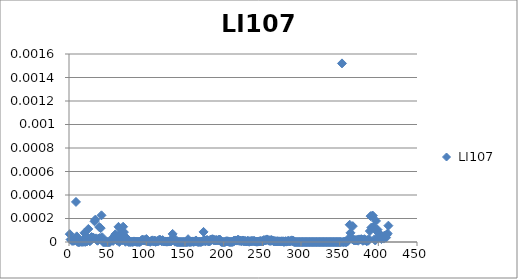
| Category |  LI107  |
|---|---|
| 0 | 0 |
| 1 | 0 |
| 2 | 0 |
| 3 | 0 |
| 4 | 0 |
| 5 | 0 |
| 6 | 0 |
| 7 | 0 |
| 8 | 0 |
| 9 | 0 |
| 10 | 0 |
| 11 | 0 |
| 12 | 0 |
| 13 | 0 |
| 14 | 0 |
| 15 | 0 |
| 16 | 0 |
| 17 | 0 |
| 18 | 0 |
| 19 | 0 |
| 20 | 0 |
| 21 | 0 |
| 22 | 0 |
| 23 | 0 |
| 24 | 0 |
| 25 | 0 |
| 26 | 0 |
| 27 | 0 |
| 28 | 0 |
| 29 | 0 |
| 30 | 0 |
| 31 | 0 |
| 32 | 0 |
| 33 | 0 |
| 34 | 0 |
| 35 | 0 |
| 36 | 0 |
| 37 | 0 |
| 38 | 0 |
| 39 | 0 |
| 40 | 0 |
| 41 | 0 |
| 42 | 0 |
| 43 | 0 |
| 44 | 0 |
| 45 | 0 |
| 46 | 0 |
| 47 | 0 |
| 48 | 0 |
| 49 | 0 |
| 50 | 0 |
| 51 | 0 |
| 52 | 0 |
| 53 | 0 |
| 54 | 0 |
| 55 | 0 |
| 56 | 0 |
| 57 | 0 |
| 58 | 0 |
| 59 | 0 |
| 60 | 0 |
| 61 | 0 |
| 62 | 0 |
| 63 | 0 |
| 64 | 0 |
| 65 | 0 |
| 66 | 0 |
| 67 | 0 |
| 68 | 0 |
| 69 | 0 |
| 70 | 0 |
| 71 | 0 |
| 72 | 0 |
| 73 | 0 |
| 74 | 0 |
| 75 | 0 |
| 76 | 0 |
| 77 | 0 |
| 78 | 0 |
| 79 | 0 |
| 80 | 0 |
| 81 | 0 |
| 82 | 0 |
| 83 | 0 |
| 84 | 0 |
| 85 | 0 |
| 86 | 0 |
| 87 | 0 |
| 88 | 0 |
| 89 | 0 |
| 90 | 0 |
| 91 | 0 |
| 92 | 0 |
| 93 | 0 |
| 94 | 0 |
| 95 | 0 |
| 96 | 0 |
| 97 | 0 |
| 98 | 0 |
| 99 | 0 |
| 100 | 0 |
| 101 | 0 |
| 102 | 0 |
| 103 | 0 |
| 104 | 0 |
| 105 | 0 |
| 106 | 0 |
| 107 | 0 |
| 108 | 0 |
| 109 | 0 |
| 110 | 0 |
| 111 | 0 |
| 112 | 0 |
| 113 | 0 |
| 114 | 0 |
| 115 | 0 |
| 116 | 0 |
| 117 | 0 |
| 118 | 0 |
| 119 | 0 |
| 120 | 0 |
| 121 | 0 |
| 122 | 0 |
| 123 | 0 |
| 124 | 0 |
| 125 | 0 |
| 126 | 0 |
| 127 | 0 |
| 128 | 0 |
| 129 | 0 |
| 130 | 0 |
| 131 | 0 |
| 132 | 0 |
| 133 | 0 |
| 134 | 0 |
| 135 | 0 |
| 136 | 0 |
| 137 | 0 |
| 138 | 0 |
| 139 | 0 |
| 140 | 0 |
| 141 | 0 |
| 142 | 0 |
| 143 | 0 |
| 144 | 0 |
| 145 | 0 |
| 146 | 0 |
| 147 | 0 |
| 148 | 0 |
| 149 | 0 |
| 150 | 0 |
| 151 | 0 |
| 152 | 0 |
| 153 | 0 |
| 154 | 0 |
| 155 | 0 |
| 156 | 0 |
| 157 | 0 |
| 158 | 0 |
| 159 | 0 |
| 160 | 0 |
| 161 | 0 |
| 162 | 0 |
| 163 | 0 |
| 164 | 0 |
| 165 | 0 |
| 166 | 0 |
| 167 | 0 |
| 168 | 0 |
| 169 | 0 |
| 170 | 0 |
| 171 | 0 |
| 172 | 0 |
| 173 | 0 |
| 174 | 0 |
| 175 | 0 |
| 176 | 0 |
| 177 | 0 |
| 178 | 0 |
| 179 | 0 |
| 180 | 0 |
| 181 | 0 |
| 182 | 0 |
| 183 | 0 |
| 184 | 0 |
| 185 | 0 |
| 186 | 0 |
| 187 | 0 |
| 188 | 0 |
| 189 | 0 |
| 190 | 0 |
| 191 | 0 |
| 192 | 0 |
| 193 | 0 |
| 194 | 0 |
| 195 | 0 |
| 196 | 0 |
| 197 | 0 |
| 198 | 0 |
| 199 | 0 |
| 200 | 0 |
| 201 | 0 |
| 202 | 0 |
| 203 | 0 |
| 204 | 0 |
| 205 | 0 |
| 206 | 0 |
| 207 | 0 |
| 208 | 0 |
| 209 | 0 |
| 210 | 0 |
| 211 | 0 |
| 212 | 0 |
| 213 | 0 |
| 214 | 0 |
| 215 | 0 |
| 216 | 0 |
| 217 | 0 |
| 218 | 0 |
| 219 | 0 |
| 220 | 0 |
| 221 | 0 |
| 222 | 0 |
| 223 | 0 |
| 224 | 0 |
| 225 | 0 |
| 226 | 0 |
| 227 | 0 |
| 228 | 0 |
| 229 | 0 |
| 230 | 0 |
| 231 | 0 |
| 232 | 0 |
| 233 | 0 |
| 234 | 0 |
| 235 | 0 |
| 236 | 0 |
| 237 | 0 |
| 238 | 0 |
| 239 | 0 |
| 240 | 0 |
| 241 | 0 |
| 242 | 0 |
| 243 | 0 |
| 244 | 0 |
| 245 | 0 |
| 246 | 0 |
| 247 | 0 |
| 248 | 0 |
| 249 | 0 |
| 250 | 0 |
| 251 | 0 |
| 252 | 0 |
| 253 | 0 |
| 254 | 0 |
| 255 | 0 |
| 256 | 0 |
| 257 | 0 |
| 258 | 0 |
| 259 | 0 |
| 260 | 0 |
| 261 | 0 |
| 262 | 0 |
| 263 | 0 |
| 264 | 0 |
| 265 | 0 |
| 266 | 0 |
| 267 | 0 |
| 268 | 0 |
| 269 | 0 |
| 270 | 0 |
| 271 | 0 |
| 272 | 0 |
| 273 | 0 |
| 274 | 0 |
| 275 | 0 |
| 276 | 0 |
| 277 | 0 |
| 278 | 0 |
| 279 | 0 |
| 280 | 0 |
| 281 | 0 |
| 282 | 0 |
| 283 | 0 |
| 284 | 0 |
| 285 | 0 |
| 286 | 0 |
| 287 | 0 |
| 288 | 0 |
| 289 | 0 |
| 290 | 0 |
| 291 | 0 |
| 292 | 0 |
| 293 | 0 |
| 294 | 0 |
| 295 | 0 |
| 296 | 0 |
| 297 | 0 |
| 298 | 0 |
| 299 | 0 |
| 300 | 0 |
| 301 | 0 |
| 302 | 0 |
| 303 | 0 |
| 304 | 0 |
| 305 | 0 |
| 306 | 0 |
| 307 | 0 |
| 308 | 0 |
| 309 | 0 |
| 310 | 0 |
| 311 | 0 |
| 312 | 0 |
| 313 | 0 |
| 314 | 0 |
| 315 | 0 |
| 316 | 0 |
| 317 | 0 |
| 318 | 0 |
| 319 | 0 |
| 320 | 0 |
| 321 | 0 |
| 322 | 0 |
| 323 | 0 |
| 324 | 0 |
| 325 | 0 |
| 326 | 0 |
| 327 | 0 |
| 328 | 0 |
| 329 | 0 |
| 330 | 0 |
| 331 | 0 |
| 332 | 0 |
| 333 | 0 |
| 334 | 0 |
| 335 | 0 |
| 336 | 0 |
| 337 | 0 |
| 338 | 0 |
| 339 | 0 |
| 340 | 0 |
| 341 | 0 |
| 342 | 0 |
| 343 | 0 |
| 344 | 0 |
| 345 | 0 |
| 346 | 0 |
| 347 | 0 |
| 348 | 0 |
| 349 | 0 |
| 350 | 0 |
| 351 | 0 |
| 352 | 0.002 |
| 353 | 0 |
| 354 | 0 |
| 355 | 0 |
| 356 | 0 |
| 357 | 0 |
| 358 | 0 |
| 359 | 0 |
| 360 | 0 |
| 361 | 0 |
| 362 | 0 |
| 363 | 0 |
| 364 | 0 |
| 365 | 0 |
| 366 | 0 |
| 367 | 0 |
| 368 | 0 |
| 369 | 0 |
| 370 | 0 |
| 371 | 0 |
| 372 | 0 |
| 373 | 0 |
| 374 | 0 |
| 375 | 0 |
| 376 | 0 |
| 377 | 0 |
| 378 | 0 |
| 379 | 0 |
| 380 | 0 |
| 381 | 0 |
| 382 | 0 |
| 383 | 0 |
| 384 | 0 |
| 385 | 0 |
| 386 | 0 |
| 387 | 0 |
| 388 | 0 |
| 389 | 0 |
| 390 | 0 |
| 391 | 0 |
| 392 | 0 |
| 393 | 0 |
| 394 | 0 |
| 395 | 0 |
| 396 | 0 |
| 397 | 0 |
| 398 | 0 |
| 399 | 0 |
| 400 | 0 |
| 401 | 0 |
| 402 | 0 |
| 403 | 0 |
| 404 | 0 |
| 405 | 0 |
| 406 | 0 |
| 407 | 0 |
| 408 | 0 |
| 409 | 0 |
| 410 | 0 |
| 411 | 0 |
| 412 | 0 |